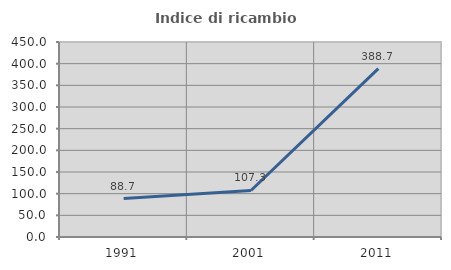
| Category | Indice di ricambio occupazionale  |
|---|---|
| 1991.0 | 88.696 |
| 2001.0 | 107.317 |
| 2011.0 | 388.679 |